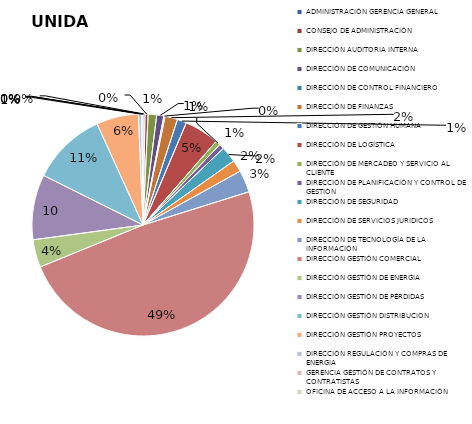
| Category | Series 0 |
|---|---|
| ADMINISTRACIÓN GERENCIA GENERAL | 8 |
| CONSEJO DE ADMINISTRACIÓN | 12 |
| DIRECCIÓN AUDITORIA INTERNA | 34 |
| DIRECCIÓN DE COMUNICACIÓN | 28 |
| DIRECCIÓN DE CONTROL FINANCIERO | 5 |
| DIRECCIÓN DE FINANZAS | 50 |
| DIRECCIÓN DE GESTIÓN HUMANA | 37 |
| DIRECCIÓN DE LOGÍSTICA | 138 |
| DIRECCIÓN DE MERCADEO Y SERVICIO AL CLIENTE | 19 |
| DIRECCIÓN DE PLANIFICACIÓN Y CONTROL DE GESTIÓN  | 20 |
| DIRECCIÓN DE SEGURIDAD  | 64 |
| DIRECCIÓN DE SERVICIOS JURIDICOS | 47 |
| DIRECCIÓN DE TECNOLOGÍA DE LA INFORMACIÓN | 88 |
| DIRECCIÓN GESTIÓN COMERCIAL | 1327 |
| DIRECCIÓN GESTIÓN DE ENERGIA  | 110 |
| DIRECCIÓN GESTIÓN DE PÉRDIDAS | 259 |
| DIRECCIÓN GESTIÓN DISTRIBUCION | 296 |
| DIRECCIÓN GESTIÓN PROYECTOS | 167 |
| DIRECCIÓN REGULACIÓN Y COMPRAS DE ENERGIA | 13 |
| GERENCIA GESTIÓN DE CONTRATOS Y CONTRATISTAS | 4 |
| OFICINA DE ACCESO A LA INFORMACIÓN | 1 |